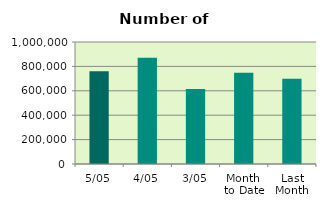
| Category | Series 0 |
|---|---|
| 5/05 | 760364 |
| 4/05 | 871688 |
| 3/05 | 613834 |
| Month 
to Date | 748628.667 |
| Last
Month | 699227 |